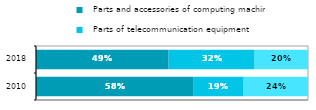
| Category |   Parts and accessories of computing machines |   Parts of telecommunication equipment |   Parts of consumer electronics |
|---|---|---|---|
| 2010 | 0.578 | 0.186 | 0.237 |
| 2018 | 0.488 | 0.316 | 0.196 |